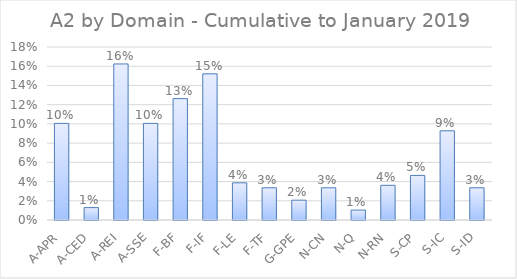
| Category | Series 0 |
|---|---|
| A-APR | 0.101 |
| A-CED | 0.013 |
| A-REI | 0.162 |
| A-SSE | 0.101 |
| F-BF | 0.126 |
| F-IF | 0.152 |
| F-LE | 0.039 |
| F-TF | 0.034 |
| G-GPE | 0.021 |
| N-CN | 0.034 |
| N-Q | 0.01 |
| N-RN | 0.036 |
| S-CP | 0.046 |
| S-IC | 0.093 |
| S-ID | 0.034 |